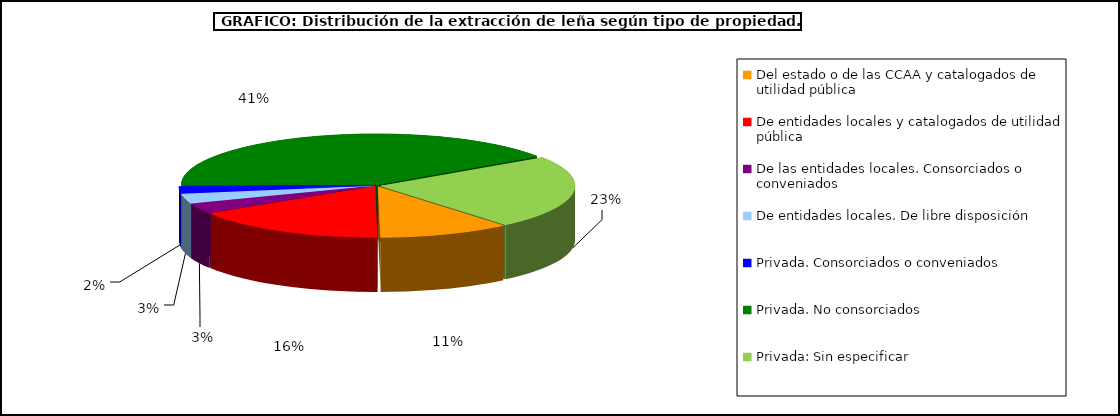
| Category | Series 0 |
|---|---|
| Del estado o de las CCAA y catalogados de utilidad pública | 168302.175 |
| De entidades locales y catalogados de utilidad pública | 250507.99 |
| De las entidades locales. Consorciados o conveniados | 50985.1 |
| De entidades locales. De libre disposición | 47968.596 |
| Privada. Consorciados o conveniados | 33686.29 |
| Privada. No consorciados | 630730.67 |
| Privada: Sin especificar | 359593.5 |